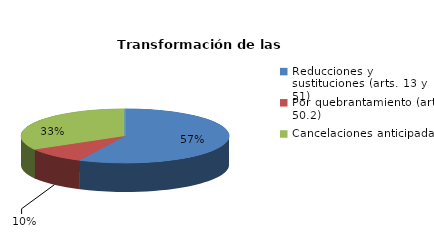
| Category | Series 0 |
|---|---|
| Reducciones y sustituciones (arts. 13 y 51) | 12 |
| Por quebrantamiento (art. 50.2) | 2 |
| Cancelaciones anticipadas | 7 |
| Traslado a Centros Penitenciarios | 0 |
| Conversión internamientos en cerrados (art. 51.2) | 0 |